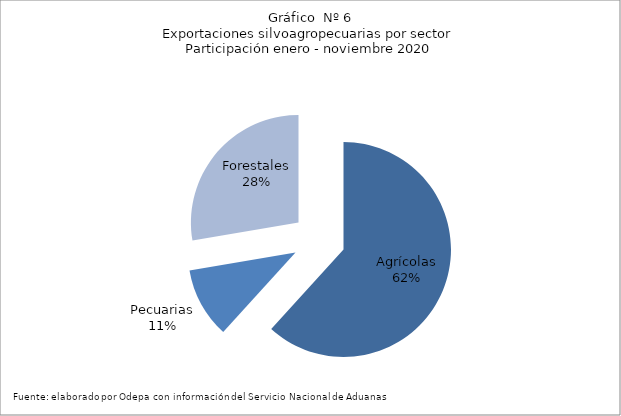
| Category | Series 0 |
|---|---|
| Agrícolas | 8744265 |
| Pecuarias | 1501541 |
| Forestales | 3917359 |